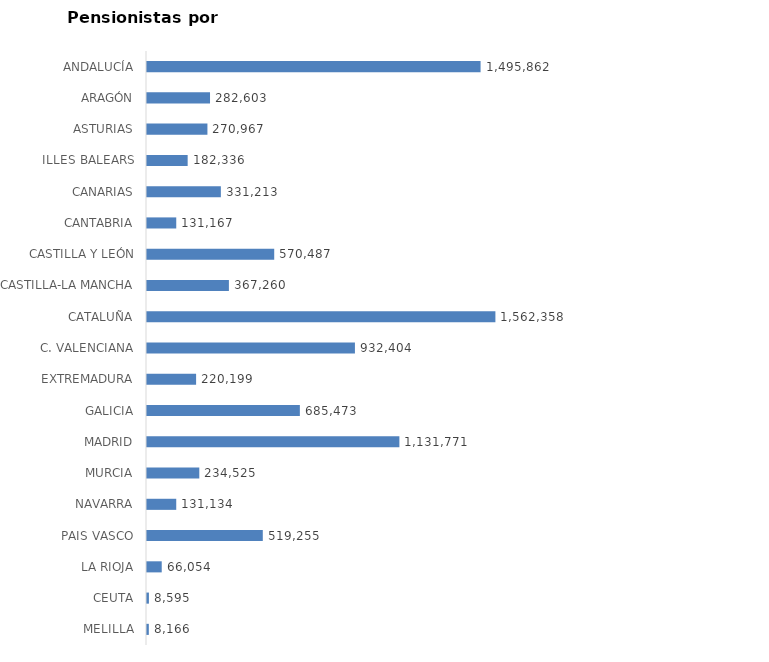
| Category | AMBOS SEXOS (1) |
|---|---|
| ANDALUCÍA | 1495862 |
| ARAGÓN | 282603 |
| ASTURIAS | 270967 |
| ILLES BALEARS | 182336 |
| CANARIAS | 331213 |
| CANTABRIA | 131167 |
| CASTILLA Y LEÓN | 570487 |
| CASTILLA-LA MANCHA | 367260 |
| CATALUÑA | 1562358 |
| C. VALENCIANA | 932404 |
| EXTREMADURA | 220199 |
| GALICIA | 685473 |
| MADRID | 1131771 |
| MURCIA | 234525 |
| NAVARRA | 131134 |
| PAIS VASCO | 519255 |
| LA RIOJA | 66054 |
| CEUTA | 8595 |
| MELILLA | 8166 |